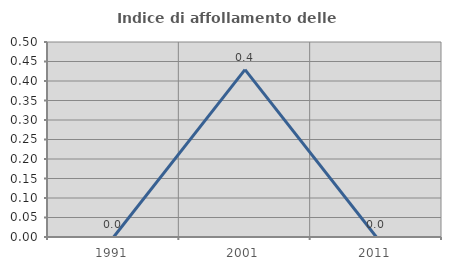
| Category | Indice di affollamento delle abitazioni  |
|---|---|
| 1991.0 | 0 |
| 2001.0 | 0.429 |
| 2011.0 | 0 |